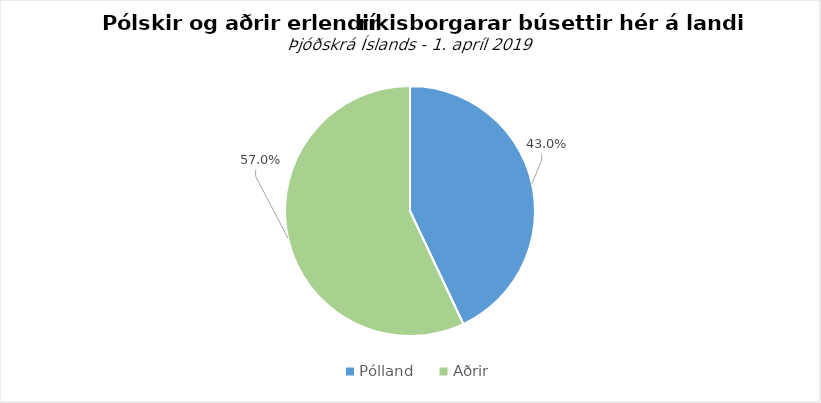
| Category | Series 0 |
|---|---|
| Pólland | 0.43 |
| Aðrir | 0.57 |